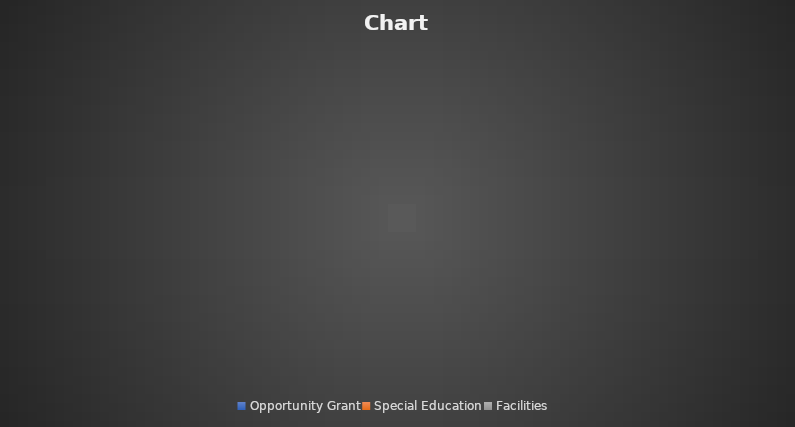
| Category | Series 0 |
|---|---|
| Opportunity Grant | 0 |
| Special Education | 0 |
| Facilities | 0 |